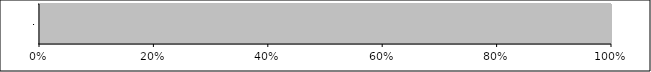
| Category | Series 0 | Series 1 | Series 2 | Series 3 | Series 4 |
|---|---|---|---|---|---|
| 0 | 0 | 0 | 0 | 0 | 44 |